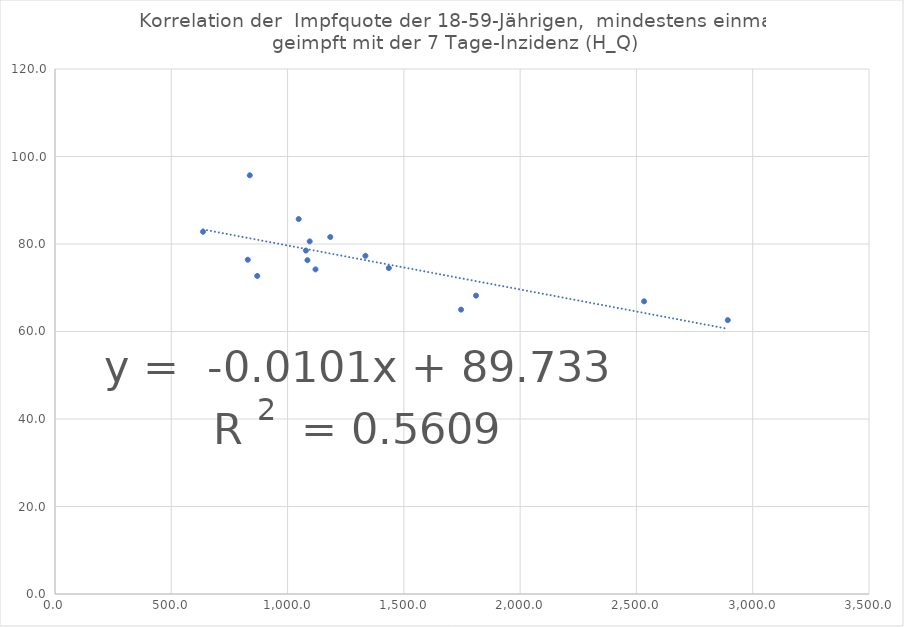
| Category | Series 0 |
|---|---|
| 1120.1445347786812 | 74.2 |
| 1435.4209681119523 | 74.5 |
| 1078.7379972565159 | 78.5 |
| 1746.0191082802548 | 65 |
| 837.4816983894582 | 95.7 |
| 1047.8001086366105 | 85.7 |
| 1334.6632620491541 | 77.3 |
| 869.5652173913043 | 72.7 |
| 828.8649461287897 | 76.4 |
| 1095.0761166564434 | 80.6 |
| 1085.4345165238678 | 76.3 |
| 1183.6528758829465 | 81.6 |
| 2892.8396272682685 | 62.6 |
| 1810.2355072463768 | 68.2 |
| 636.5205384880911 | 82.8 |
| 2532.8978068128795 | 66.9 |